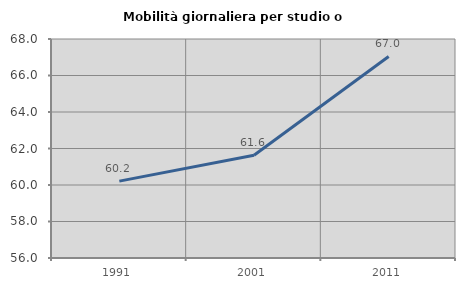
| Category | Mobilità giornaliera per studio o lavoro |
|---|---|
| 1991.0 | 60.211 |
| 2001.0 | 61.629 |
| 2011.0 | 67.041 |